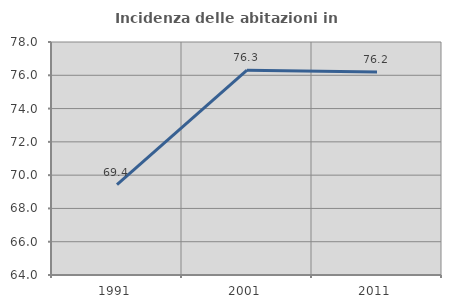
| Category | Incidenza delle abitazioni in proprietà  |
|---|---|
| 1991.0 | 69.43 |
| 2001.0 | 76.303 |
| 2011.0 | 76.19 |